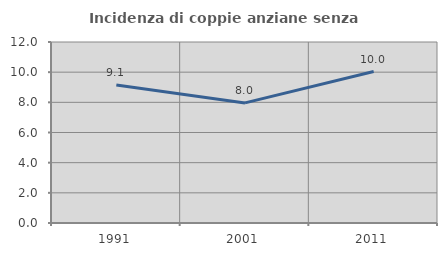
| Category | Incidenza di coppie anziane senza figli  |
|---|---|
| 1991.0 | 9.149 |
| 2001.0 | 7.962 |
| 2011.0 | 10.041 |